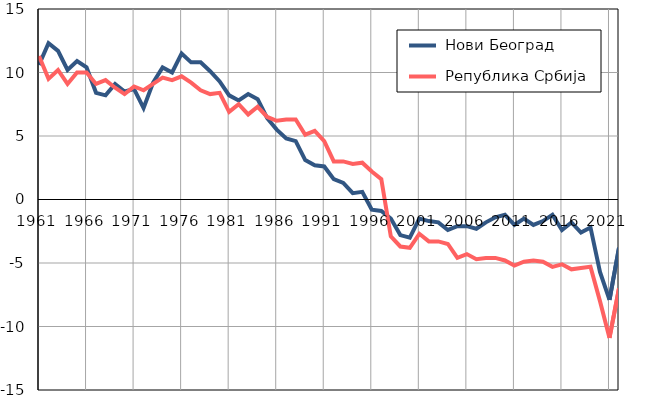
| Category |  Нови Београд |  Република Србија |
|---|---|---|
| 1961.0 | 10.6 | 11.3 |
| 1962.0 | 12.3 | 9.5 |
| 1963.0 | 11.7 | 10.2 |
| 1964.0 | 10.2 | 9.1 |
| 1965.0 | 10.9 | 10 |
| 1966.0 | 10.4 | 10 |
| 1967.0 | 8.4 | 9.1 |
| 1968.0 | 8.2 | 9.4 |
| 1969.0 | 9.1 | 8.8 |
| 1970.0 | 8.5 | 8.3 |
| 1971.0 | 8.7 | 8.9 |
| 1972.0 | 7.2 | 8.6 |
| 1973.0 | 9.2 | 9.1 |
| 1974.0 | 10.4 | 9.6 |
| 1975.0 | 10 | 9.4 |
| 1976.0 | 11.5 | 9.7 |
| 1977.0 | 10.8 | 9.2 |
| 1978.0 | 10.8 | 8.6 |
| 1979.0 | 10.1 | 8.3 |
| 1980.0 | 9.3 | 8.4 |
| 1981.0 | 8.2 | 6.9 |
| 1982.0 | 7.8 | 7.5 |
| 1983.0 | 8.3 | 6.7 |
| 1984.0 | 7.9 | 7.3 |
| 1985.0 | 6.4 | 6.5 |
| 1986.0 | 5.5 | 6.2 |
| 1987.0 | 4.8 | 6.3 |
| 1988.0 | 4.6 | 6.3 |
| 1989.0 | 3.1 | 5.1 |
| 1990.0 | 2.7 | 5.4 |
| 1991.0 | 2.6 | 4.6 |
| 1992.0 | 1.6 | 3 |
| 1993.0 | 1.3 | 3 |
| 1994.0 | 0.5 | 2.8 |
| 1995.0 | 0.6 | 2.9 |
| 1996.0 | -0.8 | 2.2 |
| 1997.0 | -0.9 | 1.6 |
| 1998.0 | -1.5 | -2.9 |
| 1999.0 | -2.8 | -3.7 |
| 2000.0 | -3 | -3.8 |
| 2001.0 | -1.5 | -2.7 |
| 2002.0 | -1.7 | -3.3 |
| 2003.0 | -1.8 | -3.3 |
| 2004.0 | -2.4 | -3.5 |
| 2005.0 | -2.1 | -4.6 |
| 2006.0 | -2.1 | -4.3 |
| 2007.0 | -2.3 | -4.7 |
| 2008.0 | -1.8 | -4.6 |
| 2009.0 | -1.4 | -4.6 |
| 2010.0 | -1.2 | -4.8 |
| 2011.0 | -2 | -5.2 |
| 2012.0 | -1.5 | -4.9 |
| 2013.0 | -2 | -4.8 |
| 2014.0 | -1.7 | -4.9 |
| 2015.0 | -1.2 | -5.3 |
| 2016.0 | -2.4 | -5.1 |
| 2017.0 | -1.8 | -5.5 |
| 2018.0 | -2.6 | -5.4 |
| 2019.0 | -2.2 | -5.3 |
| 2020.0 | -5.7 | -8 |
| 2021.0 | -7.9 | -10.9 |
| 2022.0 | -3.8 | -7 |